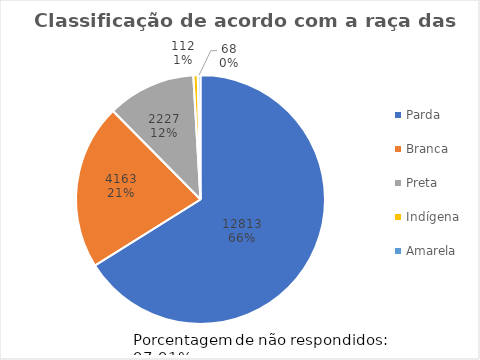
| Category | Series 0 |
|---|---|
| Parda | 12813 |
| Branca | 4163 |
| Preta | 2227 |
| Indígena | 112 |
| Amarela | 68 |